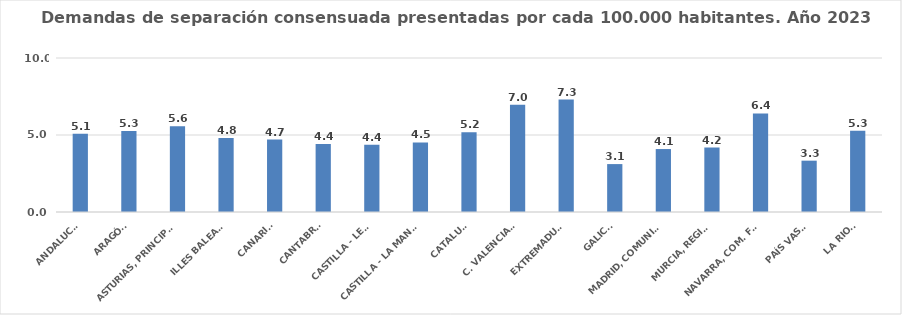
| Category | Series 0 |
|---|---|
| ANDALUCÍA | 5.077 |
| ARAGÓN | 5.262 |
| ASTURIAS, PRINCIPADO | 5.563 |
| ILLES BALEARS | 4.806 |
| CANARIAS | 4.7 |
| CANTABRIA | 4.418 |
| CASTILLA - LEÓN | 4.365 |
| CASTILLA - LA MANCHA | 4.518 |
| CATALUÑA | 5.178 |
| C. VALENCIANA | 6.956 |
| EXTREMADURA | 7.303 |
| GALICIA | 3.111 |
| MADRID, COMUNIDAD | 4.088 |
| MURCIA, REGIÓN | 4.186 |
| NAVARRA, COM. FORAL | 6.397 |
| PAÍS VASCO | 3.333 |
| LA RIOJA | 5.275 |